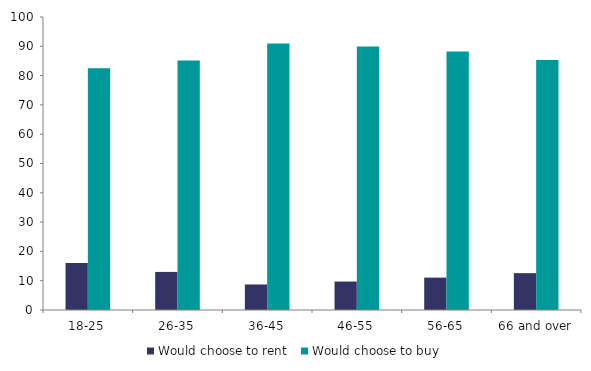
| Category | Would choose to rent  | Would choose to buy |
|---|---|---|
| 18-25 | 16.079 | 82.514 |
| 26-35 | 12.997 | 85.161 |
| 36-45 | 8.714 | 90.913 |
| 46-55 | 9.706 | 89.911 |
| 56-65 | 11.052 | 88.247 |
| 66 and over | 12.578 | 85.297 |